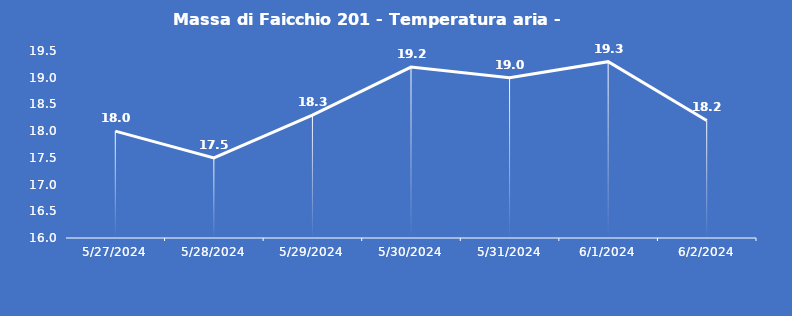
| Category | Massa di Faicchio 201 - Temperatura aria - Grezzo (°C) |
|---|---|
| 5/27/24 | 18 |
| 5/28/24 | 17.5 |
| 5/29/24 | 18.3 |
| 5/30/24 | 19.2 |
| 5/31/24 | 19 |
| 6/1/24 | 19.3 |
| 6/2/24 | 18.2 |